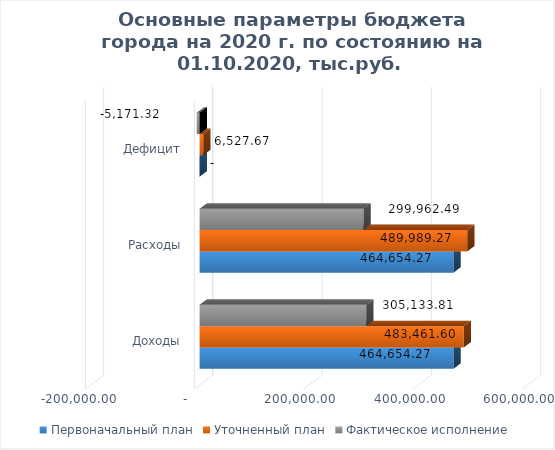
| Category | Первоначальный план | Уточненный план | Фактическое исполнение |
|---|---|---|---|
| Доходы | 464654.271 | 483461.603 | 305133.807 |
| Расходы | 464654.271 | 489989.273 | 299962.487 |
| Дефицит | 0 | 6527.67 | -5171.32 |